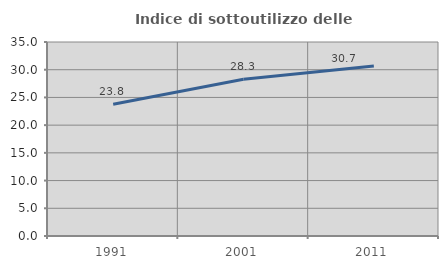
| Category | Indice di sottoutilizzo delle abitazioni  |
|---|---|
| 1991.0 | 23.753 |
| 2001.0 | 28.293 |
| 2011.0 | 30.689 |